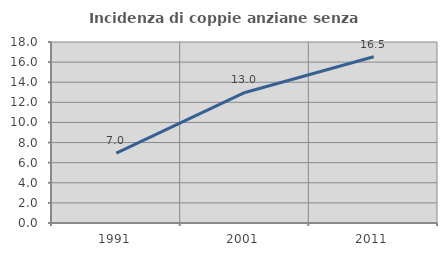
| Category | Incidenza di coppie anziane senza figli  |
|---|---|
| 1991.0 | 6.954 |
| 2001.0 | 12.98 |
| 2011.0 | 16.531 |